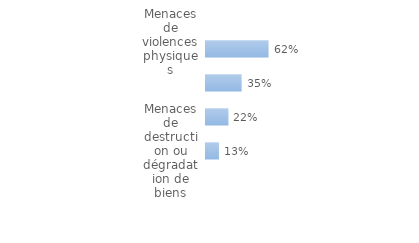
| Category | Series 0 |
|---|---|
| Menaces de destruction ou dégradation de biens | 0.128 |
| Menaces pour contraindre à faire ou ne pas faire quelque chose | 0.222 |
| Menaces de dire ou faire quelque chose qui puisse causer du tort | 0.353 |
| Menaces de violences physiques | 0.619 |